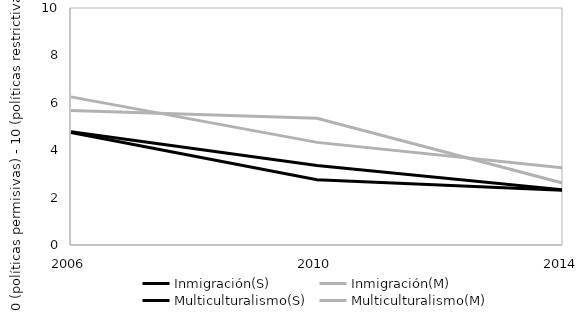
| Category | Inmigración(S) | Inmigración(M) | Multiculturalismo(S) | Multiculturalismo(M) |
|---|---|---|---|---|
| 2006.0 | 4.78 | 5.67 | 4.75 | 6.25 |
| 2010.0 | 3.35 | 5.35 | 2.75 | 4.33 |
| 2014.0 | 2.33 | 2.61 | 2.31 | 3.26 |